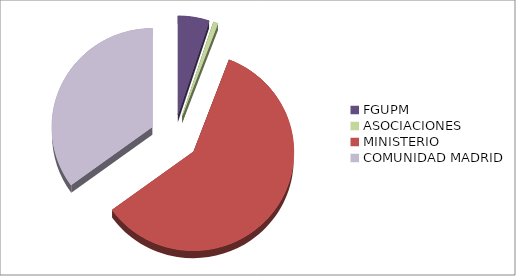
| Category | Series 0 |
|---|---|
| FGUPM | 167700.19 |
| ASOCIACIONES | 24456.66 |
| MINISTERIO | 1972574.65 |
| COMUNIDAD MADRID | 1166665.37 |